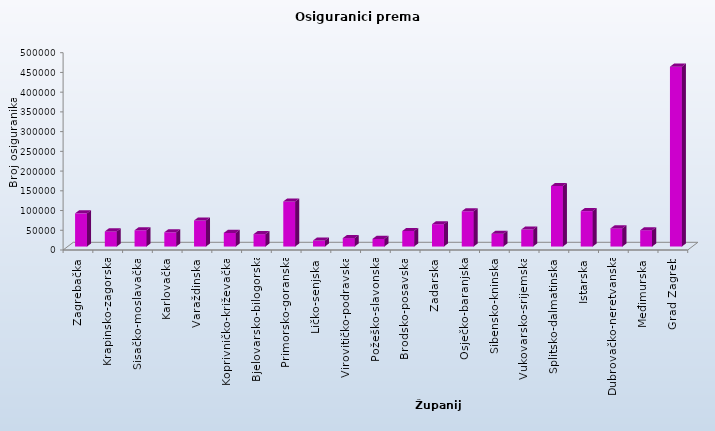
| Category | Series 0 |
|---|---|
| Zagrebačka | 84109 |
| Krapinsko-zagorska | 38282 |
| Sisačko-moslavačka | 41240 |
| Karlovačka | 36074 |
| Varaždinska | 66028 |
| Koprivničko-križevačka | 34554 |
| Bjelovarsko-bilogorska | 31325 |
| Primorsko-goranska | 114251 |
| Ličko-senjska | 15294 |
| Virovitičko-podravska | 21300 |
| Požeško-slavonska | 19352 |
| Brodsko-posavska | 39420 |
| Zadarska | 56588 |
| Osječko-baranjska | 89375 |
| Šibensko-kninska | 32464 |
| Vukovarsko-srijemska | 43080 |
| Splitsko-dalmatinska | 153407 |
| Istarska | 89757 |
| Dubrovačko-neretvanska | 45978 |
| Međimurska | 41384 |
| Grad Zagreb | 455815 |